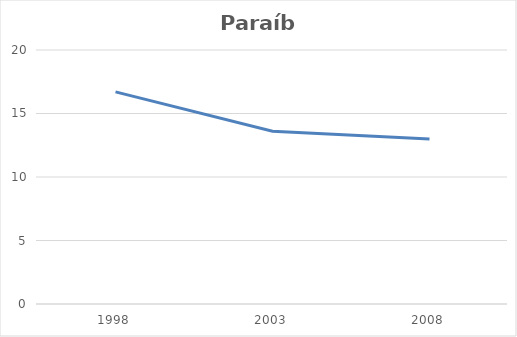
| Category | Paraíba |
|---|---|
| 1998.0 | 16.7 |
| 2003.0 | 13.6 |
| 2008.0 | 13 |